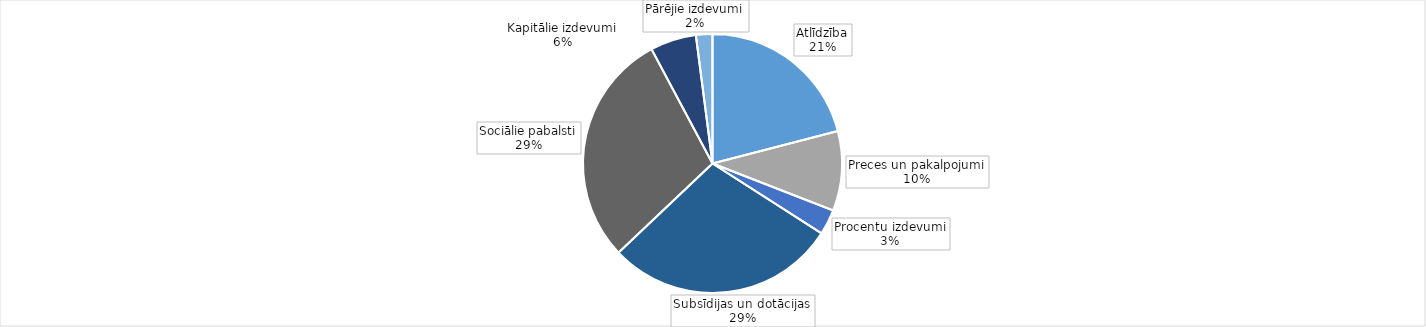
| Category | Series 0 |
|---|---|
| Atlīdzība | 325691.166 |
| Preces un pakalpojumi | 154354.47 |
| Procentu izdevumi | 49204.992 |
| Subsīdijas un dotācijas | 448047.405 |
| Sociālie pabalsti | 454898.118 |
| Kapitālie izdevumi | 89184.072 |
| Pārējie izdevumi | 31923.319 |